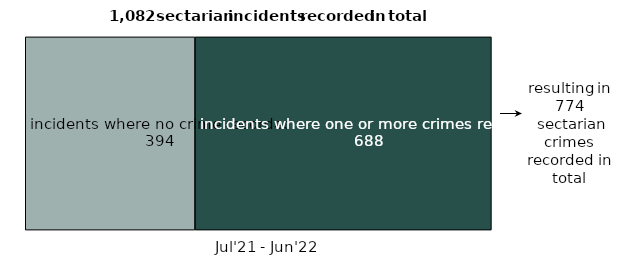
| Category | incidents where no crime recorded | incidents where one or more crimes recorded |
|---|---|---|
| 0 | 394 | 688 |